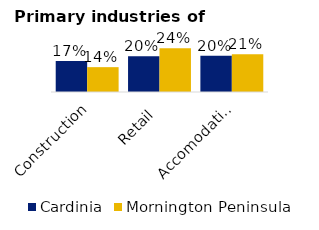
| Category | Cardinia | Mornington Peninsula |
|---|---|---|
| Construction | 0.169 | 0.136 |
| Retail | 0.195 | 0.239 |
| Accomodation | 0.197 | 0.207 |